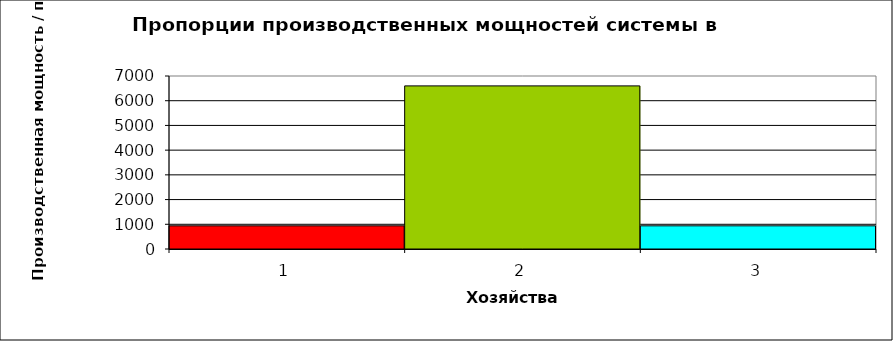
| Category | Series 0 |
|---|---|
| 0 | 938 |
| 1 | 6600 |
| 2 | 938 |